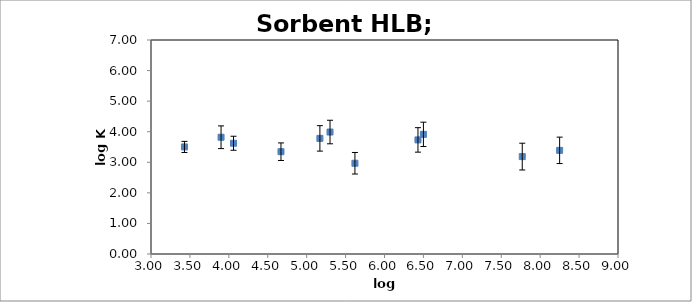
| Category | log Kow |
|---|---|
| 3.43 | 3.502 |
| 4.06 | 3.623 |
| 4.67 | 3.346 |
| 5.3 | 3.989 |
| 6.5 | 3.914 |
| 7.77 | 3.186 |
| 8.25 | 3.39 |
| 3.9 | 3.819 |
| 5.17 | 3.782 |
| 6.43 | 3.732 |
| 5.62 | 2.968 |